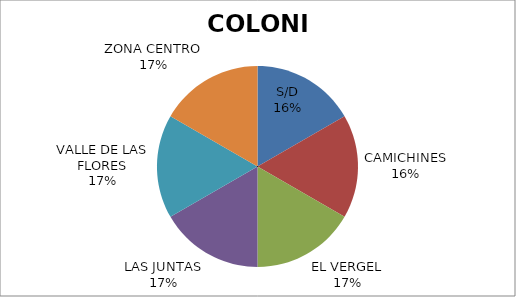
| Category | Series 0 | 1 | Series 2 |
|---|---|---|---|
| S/D | 1 |  | 1 |
| CAMICHINES | 1 |  | 1 |
| EL VERGEL | 1 |  | 1 |
| LAS JUNTAS | 1 |  | 1 |
| VALLE DE LAS FLORES | 1 |  | 1 |
| ZONA CENTRO | 1 |  | 1 |